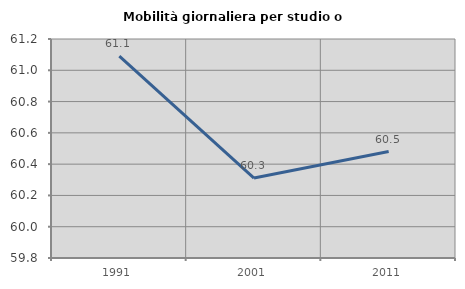
| Category | Mobilità giornaliera per studio o lavoro |
|---|---|
| 1991.0 | 61.09 |
| 2001.0 | 60.311 |
| 2011.0 | 60.481 |